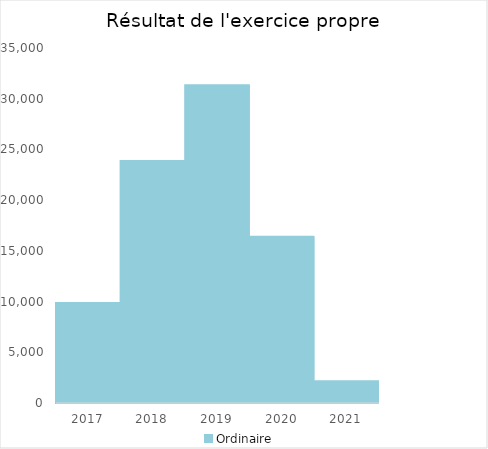
| Category |   | Ordinaire |    |
|---|---|---|---|
| 2017.0 |  | 9865.98 |  |
| 2018.0 |  | 23849.76 |  |
| 2019.0 |  | 31330.4 |  |
| 2020.0 |  | 16387.9 |  |
| 2021.0 |  | 2150.74 |  |